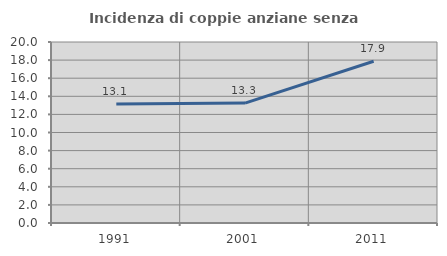
| Category | Incidenza di coppie anziane senza figli  |
|---|---|
| 1991.0 | 13.147 |
| 2001.0 | 13.253 |
| 2011.0 | 17.872 |